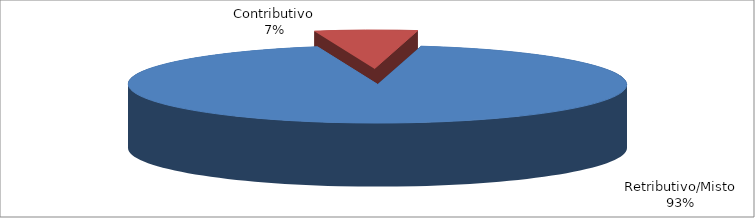
| Category | Series 1 |
|---|---|
| Retributivo/Misto | 344841 |
| Contributivo | 24560 |